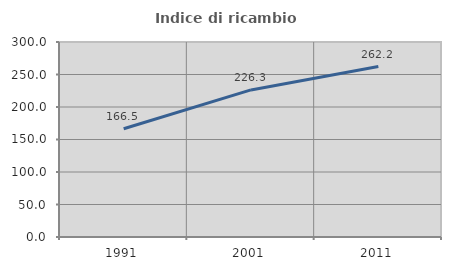
| Category | Indice di ricambio occupazionale  |
|---|---|
| 1991.0 | 166.48 |
| 2001.0 | 226.289 |
| 2011.0 | 262.174 |